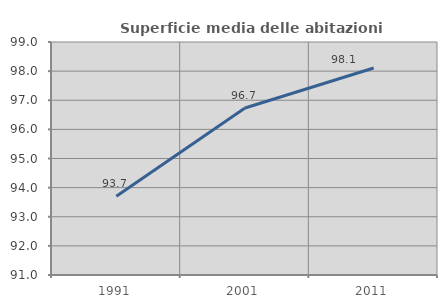
| Category | Superficie media delle abitazioni occupate |
|---|---|
| 1991.0 | 93.701 |
| 2001.0 | 96.733 |
| 2011.0 | 98.109 |